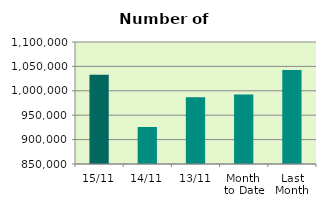
| Category | Series 0 |
|---|---|
| 15/11 | 1032638 |
| 14/11 | 925820 |
| 13/11 | 987036 |
| Month 
to Date | 992258.364 |
| Last
Month | 1042648 |